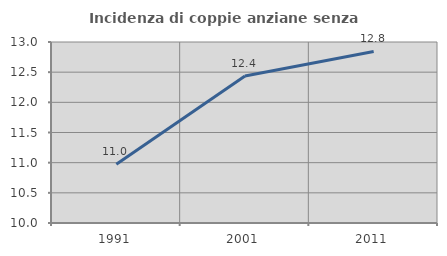
| Category | Incidenza di coppie anziane senza figli  |
|---|---|
| 1991.0 | 10.976 |
| 2001.0 | 12.435 |
| 2011.0 | 12.844 |